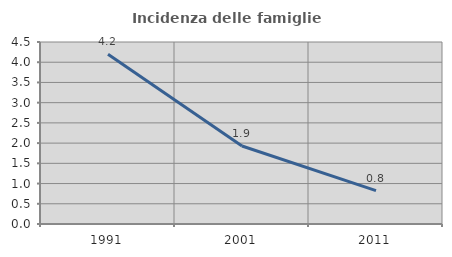
| Category | Incidenza delle famiglie numerose |
|---|---|
| 1991.0 | 4.2 |
| 2001.0 | 1.929 |
| 2011.0 | 0.825 |